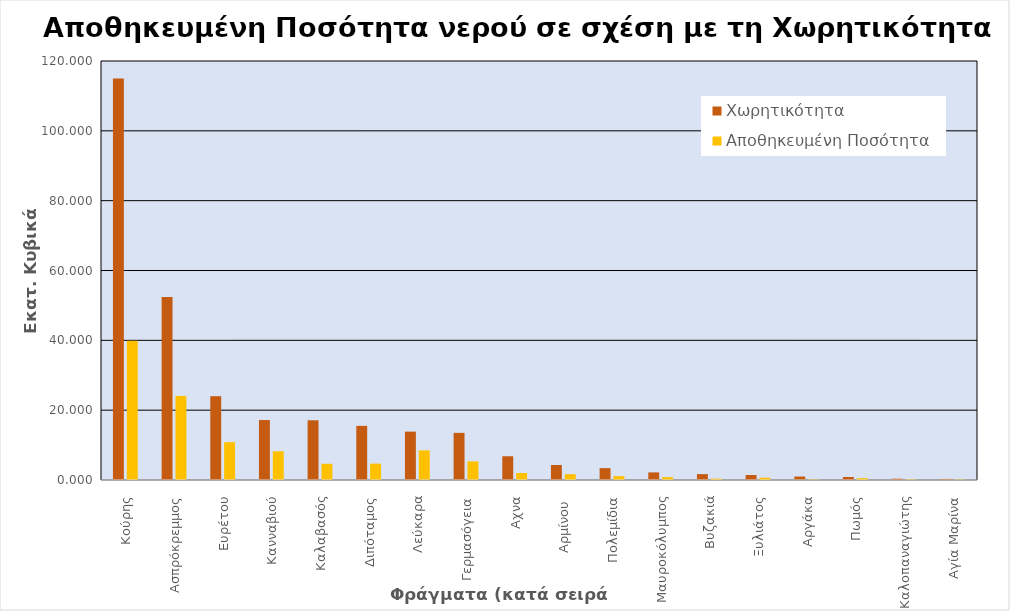
| Category | Χωρητικότητα | Αποθηκευμένη Ποσότητα |
|---|---|---|
|  Κούρης | 115 | 39.874 |
|  Ασπρόκρεμμος | 52.375 | 24.075 |
|  Ευρέτου | 24 | 10.829 |
|  Κανναβιού | 17.168 | 8.224 |
|  Καλαβασός | 17.1 | 4.643 |
|  Διπόταμος | 15.5 | 4.692 |
|  Λεύκαρα | 13.85 | 8.479 |
|  Γερμασόγεια | 13.5 | 5.337 |
|  Αχνα | 6.8 | 2.007 |
|  Αρμίνου  | 4.3 | 1.673 |
|  Πολεμίδια | 3.4 | 1.104 |
|  Μαυροκόλυμπος | 2.18 | 0.81 |
|  Βυζακιά | 1.69 | 0.377 |
|  Ξυλιάτος | 1.43 | 0.658 |
|  Αργάκα | 0.99 | 0.155 |
|  Πωμός | 0.86 | 0.516 |
|  Καλοπαναγιώτης | 0.363 | 0.186 |
|  Αγία Μαρίνα | 0.298 | 0.158 |